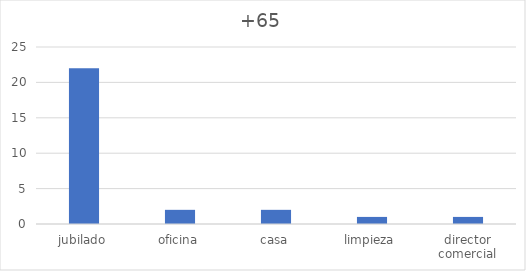
| Category | Series 0 |
|---|---|
| jubilado | 22 |
| oficina | 2 |
| casa | 2 |
| limpieza | 1 |
| director comercial | 1 |